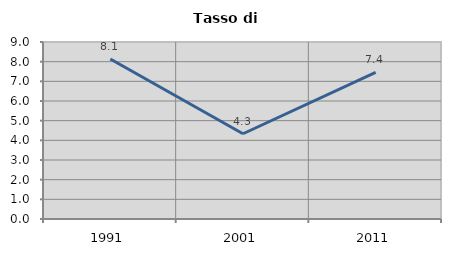
| Category | Tasso di disoccupazione   |
|---|---|
| 1991.0 | 8.137 |
| 2001.0 | 4.335 |
| 2011.0 | 7.45 |